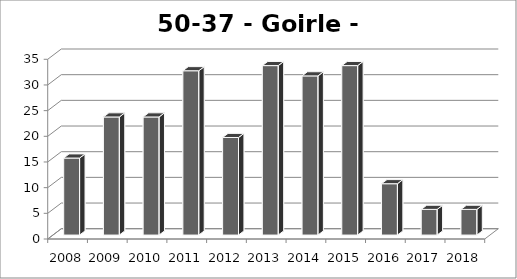
| Category | Goirle- Breehees |
|---|---|
| 2008.0 | 15 |
| 2009.0 | 23 |
| 2010.0 | 23 |
| 2011.0 | 32 |
| 2012.0 | 19 |
| 2013.0 | 33 |
| 2014.0 | 31 |
| 2015.0 | 33 |
| 2016.0 | 10 |
| 2017.0 | 5 |
| 2018.0 | 5 |